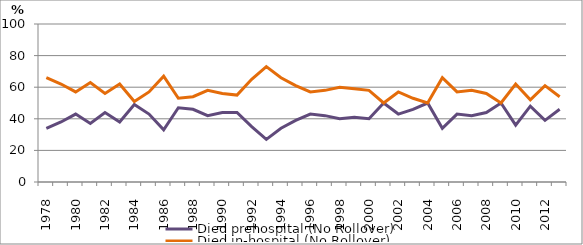
| Category | Died prehospital (No Rollover) | Died in-hospital (No Rollover) |
|---|---|---|
| 1978.0 | 34 | 66 |
| 1979.0 | 38 | 62 |
| 1980.0 | 43 | 57 |
| 1981.0 | 37 | 63 |
| 1982.0 | 44 | 56 |
| 1983.0 | 38 | 62 |
| 1984.0 | 49 | 51 |
| 1985.0 | 43 | 57 |
| 1986.0 | 33 | 67 |
| 1987.0 | 47 | 53 |
| 1988.0 | 46 | 54 |
| 1989.0 | 42 | 58 |
| 1990.0 | 44 | 56 |
| 1991.0 | 44 | 55 |
| 1992.0 | 35 | 65 |
| 1993.0 | 27 | 73 |
| 1994.0 | 34 | 66 |
| 1995.0 | 39 | 61 |
| 1996.0 | 43 | 57 |
| 1997.0 | 42 | 58 |
| 1998.0 | 40 | 60 |
| 1999.0 | 41 | 59 |
| 2000.0 | 40 | 58 |
| 2001.0 | 50 | 50 |
| 2002.0 | 43 | 57 |
| 2003.0 | 46 | 53 |
| 2004.0 | 50 | 50 |
| 2005.0 | 34 | 66 |
| 2006.0 | 43 | 57 |
| 2007.0 | 42 | 58 |
| 2008.0 | 44 | 56 |
| 2009.0 | 50 | 50 |
| 2010.0 | 36 | 62 |
| 2011.0 | 48 | 52 |
| 2012.0 | 39 | 61 |
| 2013.0 | 46 | 54 |